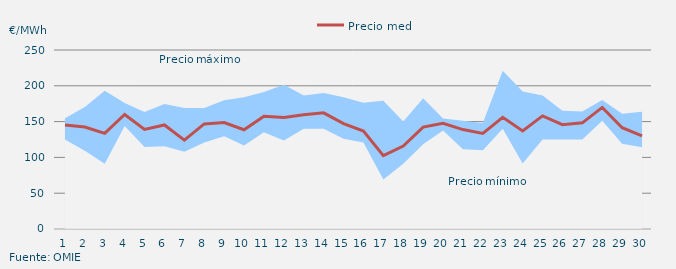
| Category | Precio medio |
|---|---|
| 1.0 | 145.22 |
| 2.0 | 142.42 |
| 3.0 | 133.5 |
| 4.0 | 159.92 |
| 5.0 | 139.16 |
| 6.0 | 145.3 |
| 7.0 | 124.2 |
| 8.0 | 146.73 |
| 9.0 | 148.62 |
| 10.0 | 138.62 |
| 11.0 | 157.54 |
| 12.0 | 155.71 |
| 13.0 | 159.45 |
| 14.0 | 162.22 |
| 15.0 | 147.25 |
| 16.0 | 136.83 |
| 17.0 | 102.45 |
| 18.0 | 115.77 |
| 19.0 | 142.35 |
| 20.0 | 147.54 |
| 21.0 | 138.84 |
| 22.0 | 133.45 |
| 23.0 | 155.99 |
| 24.0 | 136.99 |
| 25.0 | 158.02 |
| 26.0 | 145.65 |
| 27.0 | 148.25 |
| 28.0 | 169.86 |
| 29.0 | 141.51 |
| 30.0 | 129.98 |